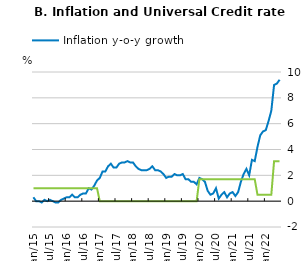
| Category | Inflation y-o-y growth | Universal credit rate change (standard allowance) |
|---|---|---|
| 2015-01-01 | 0.3 | 1 |
| 2015-02-01 | 0 | 1 |
| 2015-03-01 | 0 | 1 |
| 2015-04-01 | -0.1 | 1 |
| 2015-05-01 | 0.1 | 1 |
| 2015-06-01 | 0 | 1 |
| 2015-07-01 | 0.1 | 1 |
| 2015-08-01 | 0 | 1 |
| 2015-09-01 | -0.1 | 1 |
| 2015-10-01 | -0.1 | 1 |
| 2015-11-01 | 0.1 | 1 |
| 2015-12-01 | 0.2 | 1 |
| 2016-01-01 | 0.3 | 1 |
| 2016-02-01 | 0.3 | 1 |
| 2016-03-01 | 0.5 | 1 |
| 2016-04-01 | 0.3 | 1 |
| 2016-05-01 | 0.3 | 1 |
| 2016-06-01 | 0.5 | 1 |
| 2016-07-01 | 0.6 | 1 |
| 2016-08-01 | 0.6 | 1 |
| 2016-09-01 | 1 | 1 |
| 2016-10-01 | 0.9 | 1 |
| 2016-11-01 | 1.2 | 1 |
| 2016-12-01 | 1.6 | 1 |
| 2017-01-01 | 1.8 | 0 |
| 2017-02-01 | 2.3 | 0 |
| 2017-03-01 | 2.3 | 0 |
| 2017-04-01 | 2.7 | 0 |
| 2017-05-01 | 2.9 | 0 |
| 2017-06-01 | 2.6 | 0 |
| 2017-07-01 | 2.6 | 0 |
| 2017-08-01 | 2.9 | 0 |
| 2017-09-01 | 3 | 0 |
| 2017-10-01 | 3 | 0 |
| 2017-11-01 | 3.1 | 0 |
| 2017-12-01 | 3 | 0 |
| 2018-01-01 | 3 | 0 |
| 2018-02-01 | 2.7 | 0 |
| 2018-03-01 | 2.5 | 0 |
| 2018-04-01 | 2.4 | 0 |
| 2018-05-01 | 2.4 | 0 |
| 2018-06-01 | 2.4 | 0 |
| 2018-07-01 | 2.5 | 0 |
| 2018-08-01 | 2.7 | 0 |
| 2018-09-01 | 2.4 | 0 |
| 2018-10-01 | 2.4 | 0 |
| 2018-11-01 | 2.3 | 0 |
| 2018-12-01 | 2.1 | 0 |
| 2019-01-01 | 1.8 | 0 |
| 2019-02-01 | 1.9 | 0 |
| 2019-03-01 | 1.9 | 0 |
| 2019-04-01 | 2.1 | 0 |
| 2019-05-01 | 2 | 0 |
| 2019-06-01 | 2 | 0 |
| 2019-07-01 | 2.1 | 0 |
| 2019-08-01 | 1.7 | 0 |
| 2019-09-01 | 1.7 | 0 |
| 2019-10-01 | 1.5 | 0 |
| 2019-11-01 | 1.5 | 0 |
| 2019-12-01 | 1.3 | 0 |
| 2020-01-01 | 1.8 | 1.7 |
| 2020-02-01 | 1.7 | 1.7 |
| 2020-03-01 | 1.5 | 1.7 |
| 2020-04-01 | 0.8 | 1.7 |
| 2020-05-01 | 0.5 | 1.7 |
| 2020-06-01 | 0.6 | 1.7 |
| 2020-07-01 | 1 | 1.7 |
| 2020-08-01 | 0.2 | 1.7 |
| 2020-09-01 | 0.5 | 1.7 |
| 2020-10-01 | 0.7 | 1.7 |
| 2020-11-01 | 0.3 | 1.7 |
| 2020-12-01 | 0.6 | 1.7 |
| 2021-01-01 | 0.7 | 1.7 |
| 2021-02-01 | 0.4 | 1.7 |
| 2021-03-01 | 0.7 | 1.7 |
| 2021-04-01 | 1.5 | 1.7 |
| 2021-05-01 | 2.1 | 1.7 |
| 2021-06-01 | 2.5 | 1.7 |
| 2021-07-01 | 2 | 1.7 |
| 2021-08-01 | 3.2 | 1.7 |
| 2021-09-01 | 3.1 | 1.7 |
| 2021-10-01 | 4.2 | 0.5 |
| 2021-11-01 | 5.1 | 0.5 |
| 2021-12-01 | 5.4 | 0.5 |
| 2022-01-01 | 5.5 | 0.5 |
| 2022-02-01 | 6.2 | 0.5 |
| 2022-03-01 | 7 | 0.5 |
| 2022-04-01 | 9 | 3.1 |
| 2022-05-01 | 9.1 | 3.1 |
| 2022-06-01 | 9.4 | 3.1 |